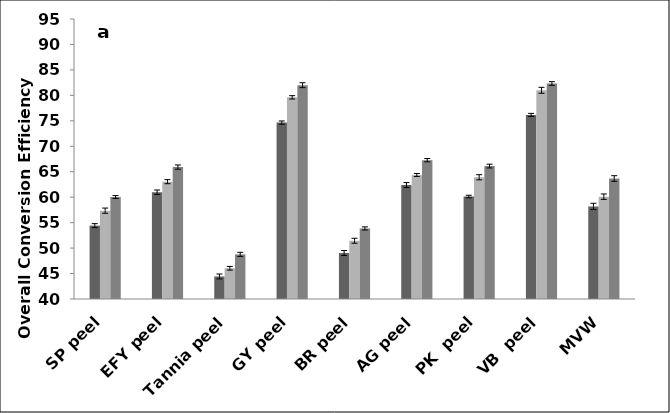
| Category | LRT  24 h | LRT  48 h | LHT  60 min. |
|---|---|---|---|
| SP peel | 54.41 | 57.35 | 60.04 |
| EFY peel | 60.98 | 63.05 | 65.91 |
| Tannia peel | 44.43 | 46.04 | 48.77 |
| GY peel | 74.65 | 79.61 | 82 |
| BR peel | 49.03 | 51.44 | 53.86 |
| AG peel | 62.39 | 64.36 | 67.27 |
| PK  peel | 60.13 | 63.91 | 66.11 |
| VB  peel | 76.16 | 81 | 82.33 |
| MVW | 58.19 | 60.1 | 63.67 |